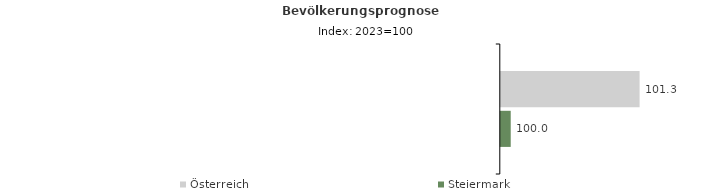
| Category | Österreich | Steiermark |
|---|---|---|
| 2023.0 | 101.3 | 100 |